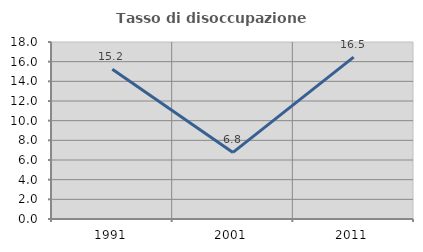
| Category | Tasso di disoccupazione giovanile  |
|---|---|
| 1991.0 | 15.221 |
| 2001.0 | 6.769 |
| 2011.0 | 16.466 |